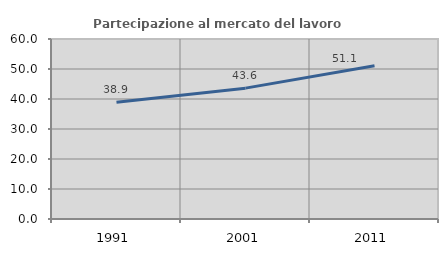
| Category | Partecipazione al mercato del lavoro  femminile |
|---|---|
| 1991.0 | 38.899 |
| 2001.0 | 43.621 |
| 2011.0 | 51.087 |